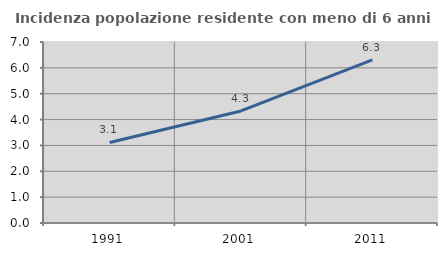
| Category | Incidenza popolazione residente con meno di 6 anni |
|---|---|
| 1991.0 | 3.116 |
| 2001.0 | 4.332 |
| 2011.0 | 6.312 |